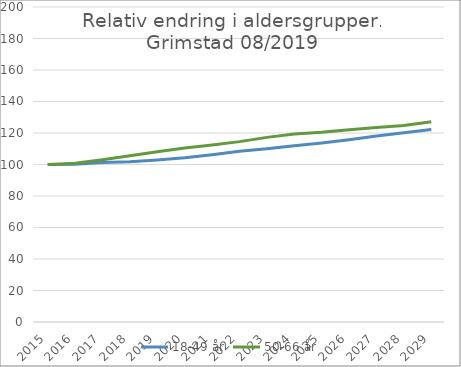
| Category | 18-49 år | 50-66 år |
|---|---|---|
| 2015.0 | 100 | 100 |
| 2016.0 | 100.162 | 100.815 |
| 2017.0 | 101.242 | 102.958 |
| 2018.0 | 101.807 | 105.614 |
| 2019.0 | 102.894 | 108.079 |
| 2020.0 | 104.319 | 110.541 |
| 2021.0 | 106.199 | 112.379 |
| 2022.0 | 108.44 | 114.524 |
| 2023.0 | 110.02 | 117.23 |
| 2024.0 | 111.863 | 119.341 |
| 2025.0 | 113.7 | 120.47 |
| 2026.0 | 115.719 | 122.053 |
| 2027.0 | 118.06 | 123.438 |
| 2028.0 | 120.112 | 124.835 |
| 2029.0 | 122.172 | 127.162 |